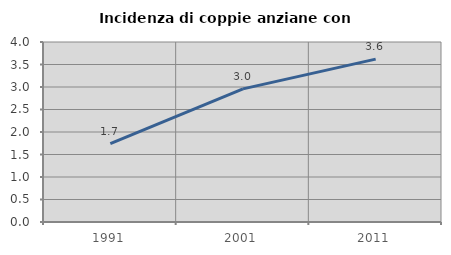
| Category | Incidenza di coppie anziane con figli |
|---|---|
| 1991.0 | 1.741 |
| 2001.0 | 2.958 |
| 2011.0 | 3.619 |